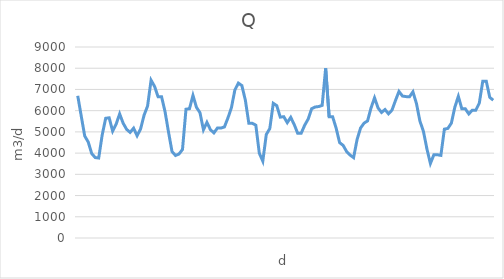
| Category | Q |
|---|---|
| 0 | 6700.8 |
| 1 | 5745.6 |
| 2 | 4804.8 |
| 3 | 4524 |
| 4 | 3979.2 |
| 5 | 3789.6 |
| 6 | 3768 |
| 7 | 4855.2 |
| 8 | 5640 |
| 9 | 5664 |
| 10 | 5035.2 |
| 11 | 5366.4 |
| 12 | 5848.8 |
| 13 | 5409.6 |
| 14 | 5119.2 |
| 15 | 4977.6 |
| 16 | 5174.4 |
| 17 | 4816.8 |
| 18 | 5140.8 |
| 19 | 5788.8 |
| 20 | 6218.4 |
| 21 | 7435.2 |
| 22 | 7144.8 |
| 23 | 6660 |
| 24 | 6660 |
| 25 | 5954.4 |
| 26 | 4989.6 |
| 27 | 4072.8 |
| 28 | 3888 |
| 29 | 3957.6 |
| 30 | 4171.2 |
| 31 | 6067.2 |
| 32 | 6093.6 |
| 33 | 6717.6 |
| 34 | 6158.4 |
| 35 | 5906.4 |
| 36 | 5100 |
| 37 | 5448 |
| 38 | 5104.8 |
| 39 | 4953.6 |
| 40 | 5181.6 |
| 41 | 5181.6 |
| 42 | 5232 |
| 43 | 5652 |
| 44 | 6132 |
| 45 | 6974.4 |
| 46 | 7298.4 |
| 47 | 7183.2 |
| 48 | 6499.2 |
| 49 | 5404.8 |
| 50 | 5404.8 |
| 51 | 5316 |
| 52 | 3993.6 |
| 53 | 3621.6 |
| 54 | 4879.2 |
| 55 | 5155.2 |
| 56 | 6345.6 |
| 57 | 6235.2 |
| 58 | 5695.2 |
| 59 | 5716.8 |
| 60 | 5436 |
| 61 | 5683.2 |
| 62 | 5344.8 |
| 63 | 4932 |
| 64 | 4939.2 |
| 65 | 5316 |
| 66 | 5606.4 |
| 67 | 6093.6 |
| 68 | 6172.8 |
| 69 | 6194.4 |
| 70 | 6247.2 |
| 71 | 7999.2 |
| 72 | 5712 |
| 73 | 5712 |
| 74 | 5176.8 |
| 75 | 4492.8 |
| 76 | 4365.6 |
| 77 | 4075.2 |
| 78 | 3907.2 |
| 79 | 3787.2 |
| 80 | 4639.2 |
| 81 | 5184 |
| 82 | 5412 |
| 83 | 5517.6 |
| 84 | 6132 |
| 85 | 6604.8 |
| 86 | 6132 |
| 87 | 5916 |
| 88 | 6052.8 |
| 89 | 5851.2 |
| 90 | 6026.4 |
| 91 | 6480 |
| 92 | 6904.8 |
| 93 | 6688.8 |
| 94 | 6662.4 |
| 95 | 6652.8 |
| 96 | 6888 |
| 97 | 6338.4 |
| 98 | 5508 |
| 99 | 5025.6 |
| 100 | 4197.6 |
| 101 | 3513.6 |
| 102 | 3924 |
| 103 | 3924 |
| 104 | 3892.8 |
| 105 | 5128.8 |
| 106 | 5162.4 |
| 107 | 5409.6 |
| 108 | 6168 |
| 109 | 6674.4 |
| 110 | 6088.8 |
| 111 | 6088.8 |
| 112 | 5846.4 |
| 113 | 6024 |
| 114 | 6024 |
| 115 | 6352.8 |
| 116 | 7389.6 |
| 117 | 7389.6 |
| 118 | 6628.8 |
| 119 | 6492 |